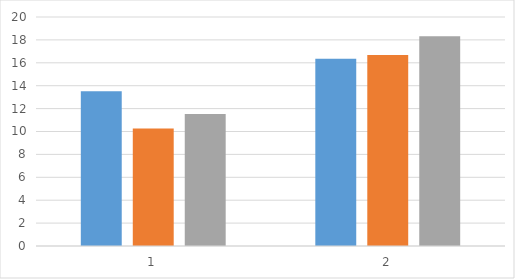
| Category | CONTROL | ANTAGONISTA 5 MIN | ANTAGONISTA 20 MIN |
|---|---|---|---|
| 0 | 13.526 | 10.262 | 11.522 |
| 1 | 16.348 | 16.691 | 18.311 |